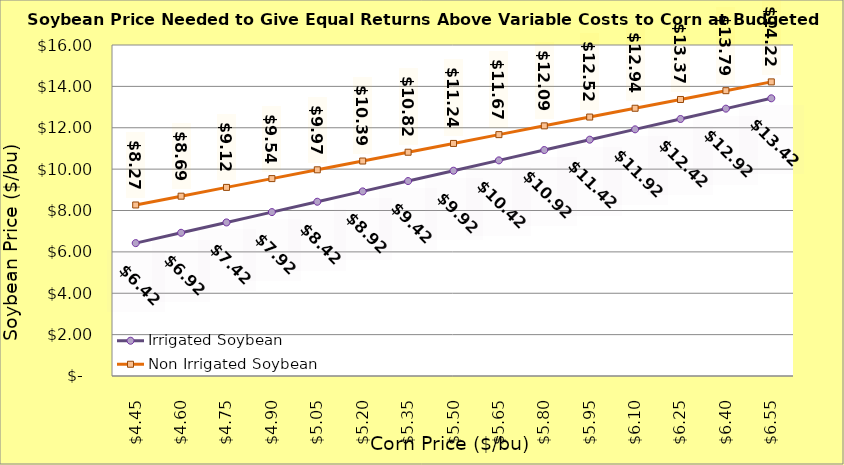
| Category | Irrigated Soybean | Non Irrigated Soybean |
|---|---|---|
| 4.4499999999999975 | 6.423 | 8.267 |
| 4.599999999999998 | 6.923 | 8.692 |
| 4.749999999999998 | 7.423 | 9.117 |
| 4.899999999999999 | 7.923 | 9.542 |
| 5.049999999999999 | 8.423 | 9.967 |
| 5.199999999999999 | 8.923 | 10.392 |
| 5.35 | 9.423 | 10.817 |
| 5.5 | 9.923 | 11.242 |
| 5.65 | 10.423 | 11.667 |
| 5.800000000000001 | 10.923 | 12.092 |
| 5.950000000000001 | 11.423 | 12.517 |
| 6.100000000000001 | 11.923 | 12.942 |
| 6.250000000000002 | 12.423 | 13.367 |
| 6.400000000000002 | 12.923 | 13.792 |
| 6.5500000000000025 | 13.423 | 14.217 |